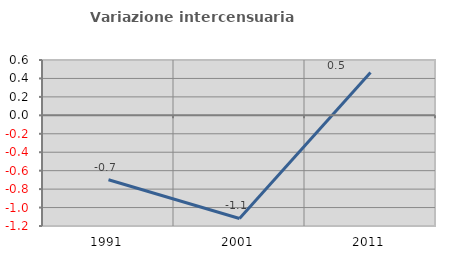
| Category | Variazione intercensuaria annua |
|---|---|
| 1991.0 | -0.699 |
| 2001.0 | -1.118 |
| 2011.0 | 0.464 |